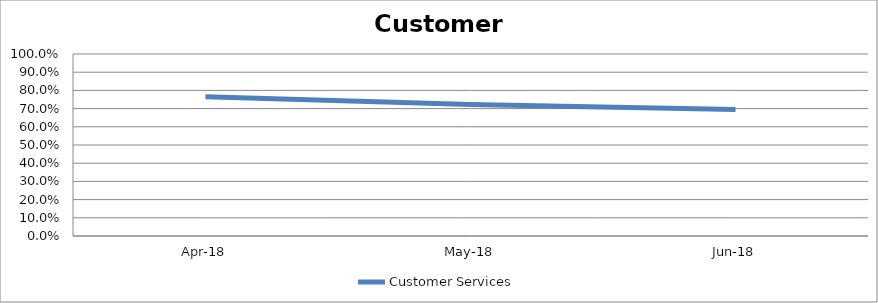
| Category | Customer Services |
|---|---|
| 2018-04-01 | 0.765 |
| 2018-05-01 | 0.722 |
| 2018-06-01 | 0.694 |